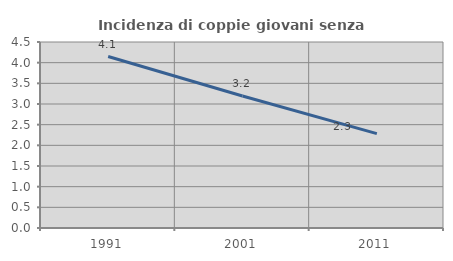
| Category | Incidenza di coppie giovani senza figli |
|---|---|
| 1991.0 | 4.149 |
| 2001.0 | 3.194 |
| 2011.0 | 2.282 |